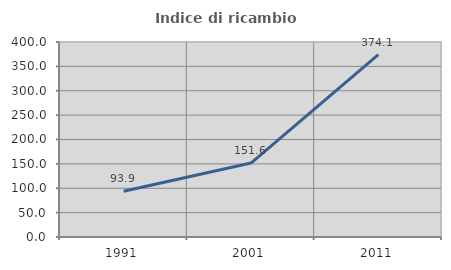
| Category | Indice di ricambio occupazionale  |
|---|---|
| 1991.0 | 93.873 |
| 2001.0 | 151.628 |
| 2011.0 | 374.058 |